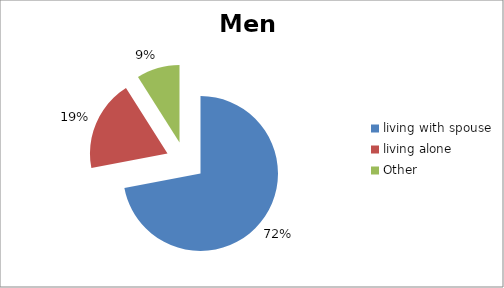
| Category | Men  |
|---|---|
| living with spouse | 0.72 |
| living alone  | 0.19 |
| Other | 0.09 |